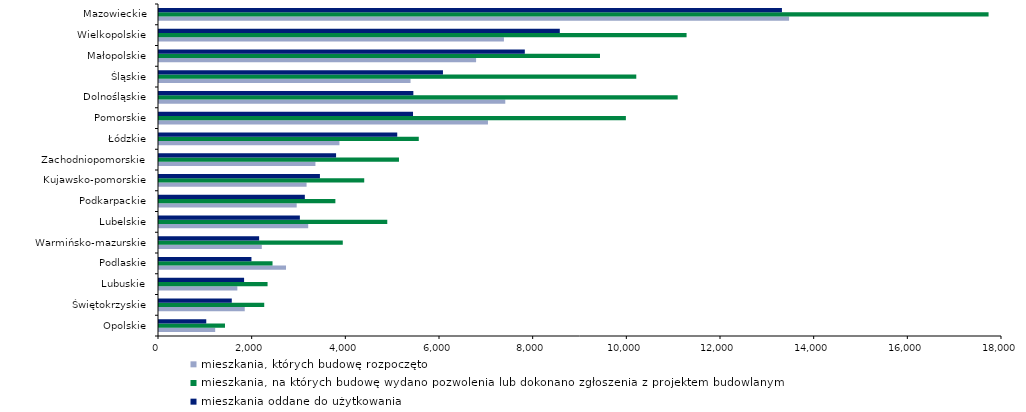
| Category | mieszkania, których budowę rozpoczęto | mieszkania, na których budowę wydano pozwolenia lub dokonano zgłoszenia z projektem budowlanym | mieszkania oddane do użytkowania |
|---|---|---|---|
| Opolskie | 1200 | 1409 | 1009 |
| Świętokrzyskie | 1831 | 2247 | 1554 |
| Lubuskie | 1673 | 2318 | 1817 |
| Podlaskie | 2712 | 2424 | 1974 |
| Warmińsko-mazurskie | 2195 | 3924 | 2138 |
| Lubelskie | 3186 | 4874 | 3008 |
| Podkarpackie | 2940 | 3766 | 3114 |
| Kujawsko-pomorskie | 3151 | 4382 | 3436 |
| Zachodniopomorskie | 3340 | 5124 | 3781 |
| Łódzkie | 3853 | 5547 | 5087 |
| Pomorskie | 7024 | 9969 | 5424 |
| Dolnośląskie | 7394 | 11075 | 5431 |
| Śląskie | 5371 | 10191 | 6063 |
| Małopolskie | 6771 | 9416 | 7811 |
| Wielkopolskie | 7365 | 11265 | 8558 |
| Mazowieckie | 13454 | 17713 | 13301 |